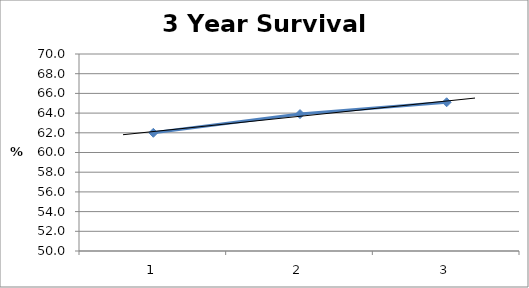
| Category | Series 0 |
|---|---|
| 0 | 62 |
| 1 | 63.9 |
| 2 | 65.1 |